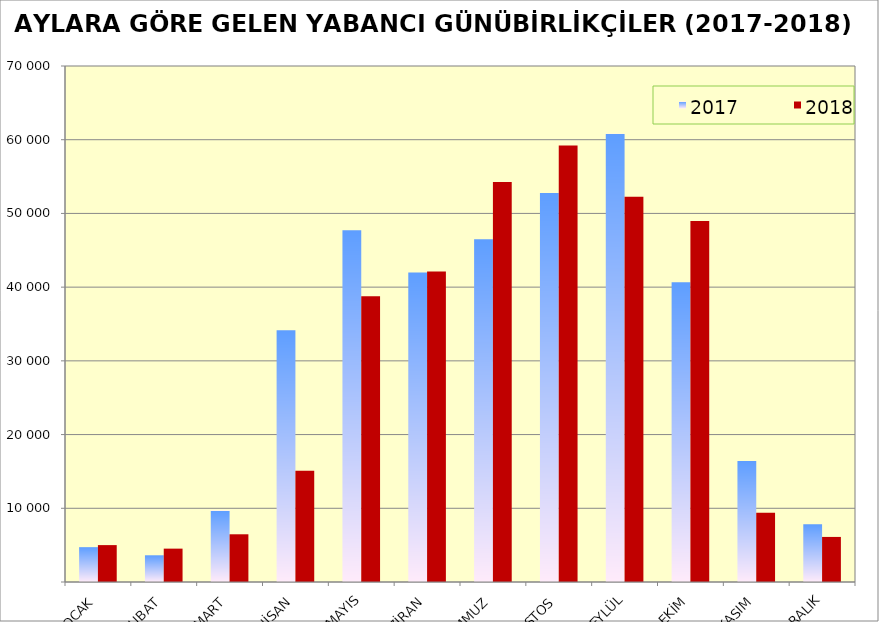
| Category | 2017 | 2018 |
|---|---|---|
| OCAK | 4726 | 5005 |
| ŞUBAT | 3624 | 4526 |
| MART | 9686 | 6473 |
| NİSAN | 34144 | 15107 |
| MAYIS | 47720 | 38777 |
| HAZİRAN | 41991 | 42111 |
| TEMMUZ | 46483 | 54250 |
| AĞUSTOS | 52776 | 59217 |
| EYLÜL | 60800 | 52254 |
| EKİM | 40647 | 48989 |
| KASIM | 16431 | 9407 |
| ARALIK | 7833 | 6114 |